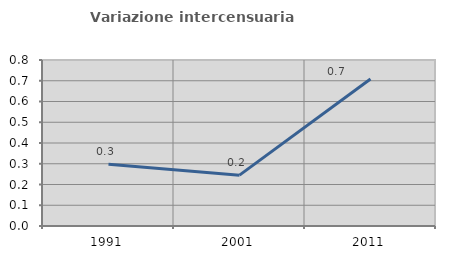
| Category | Variazione intercensuaria annua |
|---|---|
| 1991.0 | 0.297 |
| 2001.0 | 0.245 |
| 2011.0 | 0.709 |